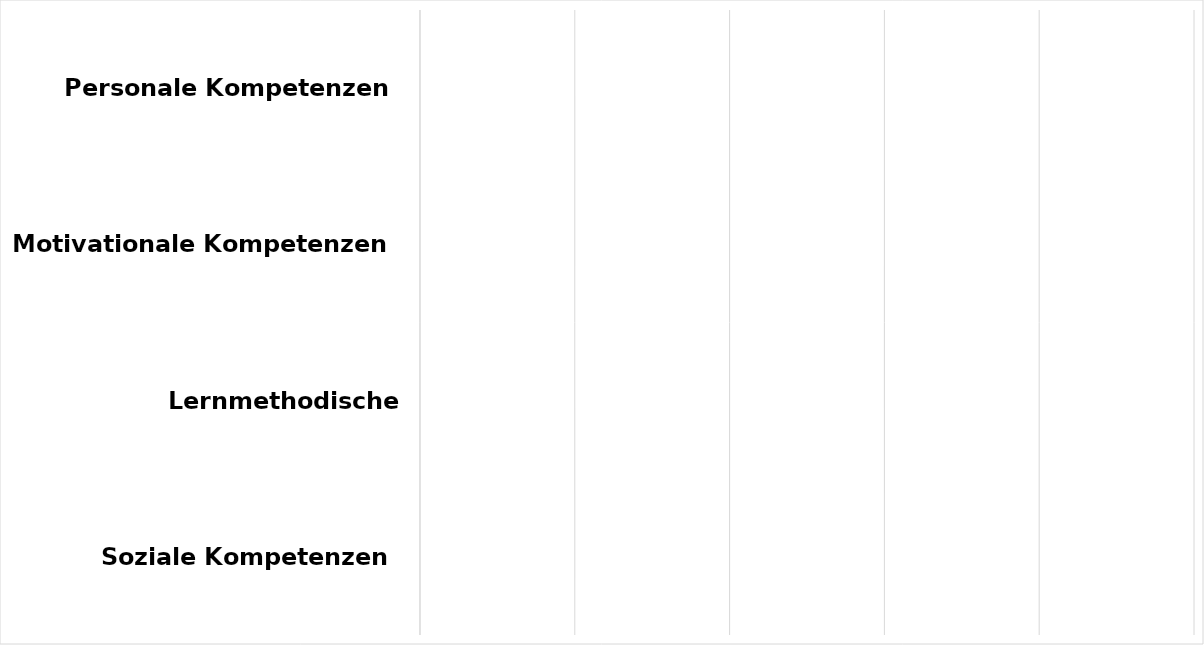
| Category | Series 0 |
|---|---|
| Soziale Kompetenzen | 0 |
| Lernmethodische Kompetenzen | 0 |
| Motivationale Kompetenzen | 0 |
| Personale Kompetenzen | 0 |